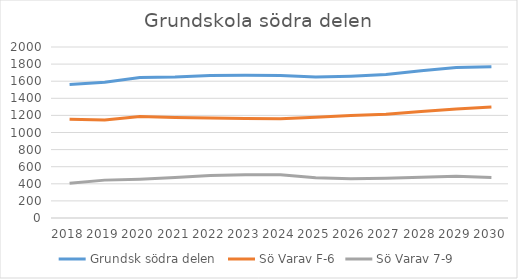
| Category | Grundsk södra delen  | Sö Varav F-6 | Sö Varav 7-9 |
|---|---|---|---|
| 2018.0 | 1562 | 1155 | 407 |
| 2019.0 | 1589 | 1146 | 443 |
| 2020.0 | 1642 | 1188 | 454 |
| 2021.0 | 1649 | 1176 | 473 |
| 2022.0 | 1667 | 1170 | 497 |
| 2023.0 | 1670 | 1165 | 505 |
| 2024.0 | 1668 | 1162 | 506 |
| 2025.0 | 1648 | 1178 | 470 |
| 2026.0 | 1659 | 1199 | 460 |
| 2027.0 | 1679 | 1213 | 466 |
| 2028.0 | 1723 | 1246 | 477 |
| 2029.0 | 1761 | 1274 | 487 |
| 2030.0 | 1770 | 1297 | 473 |